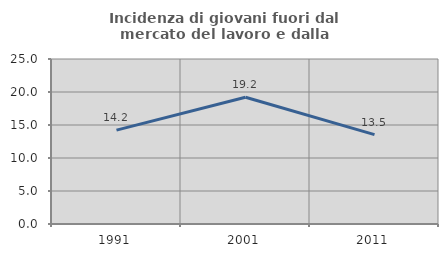
| Category | Incidenza di giovani fuori dal mercato del lavoro e dalla formazione  |
|---|---|
| 1991.0 | 14.22 |
| 2001.0 | 19.201 |
| 2011.0 | 13.537 |